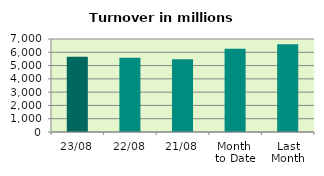
| Category | Series 0 |
|---|---|
| 23/08 | 5672.105 |
| 22/08 | 5590.031 |
| 21/08 | 5478.216 |
| Month 
to Date | 6274.094 |
| Last
Month | 6596.254 |